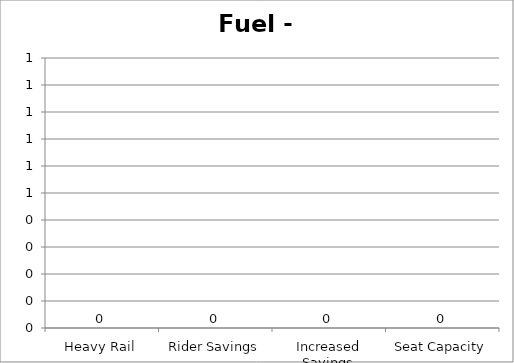
| Category | Fuel - GGE |
|---|---|
| Heavy Rail | 0 |
| Rider Savings | 0 |
| Increased Savings | 0 |
| Seat Capacity | 0 |